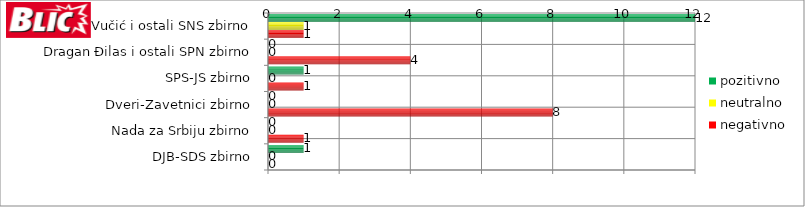
| Category | pozitivno | neutralno | negativno |
|---|---|---|---|
| Aleksandar Vučić i ostali SNS zbirno | 12 | 1 | 1 |
| Dragan Đilas i ostali SPN zbirno | 0 | 0 | 4 |
| SPS-JS zbirno | 1 | 0 | 1 |
| Dveri-Zavetnici zbirno | 0 | 0 | 8 |
| Nada za Srbiju zbirno | 0 | 0 | 1 |
| DJB-SDS zbirno | 1 | 0 | 0 |